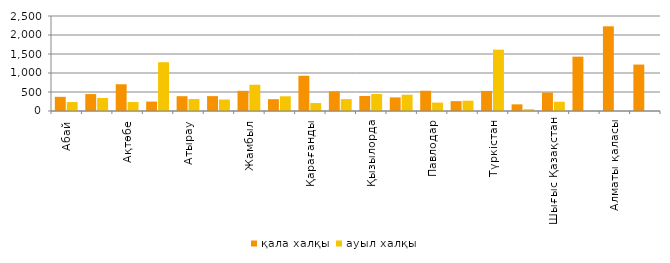
| Category | қала халқы | ауыл халқы |
|---|---|---|
| Абай | 372.556 | 235.033 |
| Ақмола | 445.712 | 342.264 |
| Ақтөбе | 703.67 | 235.735 |
| Алматы | 247.519 | 1283.648 |
| Атырау | 389.872 | 314.202 |
| Батыс Қазақстан | 391.734 | 301.527 |
| Жамбыл | 530.816 | 691.777 |
| Жетісу | 311.135 | 386.852 |
| Қарағанды | 926.202 | 209.149 |
| Қостанай | 517.698 | 312.286 |
| Қызылорда | 395.163 | 446.766 |
| Маңғыстау | 358.231 | 428.606 |
| Павлодар | 533.211 | 220.722 |
| Солтүстік Қазақстан | 259.34 | 270.749 |
| Түркістан | 528.101 | 1614.071 |
| Ұлытау | 175.425 | 46.157 |
| Шығыс Қазақстан | 483.947 | 243.106 |
| Астана қаласы | 1430.117 | 0 |
| Алматы қаласы | 2228.677 | 0 |
| Шымкент қаласы | 1222.066 | 0 |